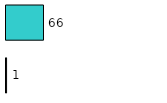
| Category | Series 0 | Series 1 |
|---|---|---|
| 0 | 1 | 66 |